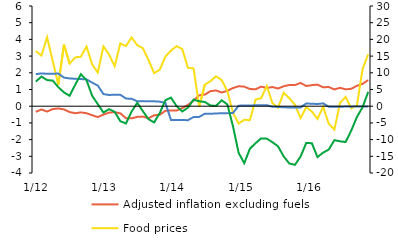
| Category | Adjusted inflation excluding fuels | Food prices |
|---|---|---|
|  1/12 | -0.338 | 3.311 |
| 2 | -0.197 | 3.036 |
| 3 | -0.32 | 4.13 |
| 4 | -0.171 | 2.702 |
| 5 | -0.134 | 1.287 |
| 6 | -0.193 | 3.686 |
| 7 | -0.351 | 2.554 |
| 8 | -0.421 | 2.92 |
| 9 | -0.37 | 2.967 |
| 10 | -0.42 | 3.572 |
| 11 | -0.54 | 2.506 |
| 12 | -0.652 | 2.015 |
|  1/13 | -0.505 | 3.583 |
| 2 | -0.381 | 3.091 |
| 3 | -0.36 | 2.394 |
| 4 | -0.424 | 3.758 |
| 5 | -0.72 | 3.601 |
| 6 | -0.727 | 4.119 |
| 7 | -0.64 | 3.656 |
| 8 | -0.622 | 3.475 |
| 9 | -0.724 | 2.771 |
| 10 | -0.545 | 1.976 |
| 11 | -0.511 | 2.189 |
| 12 | -0.275 | 2.971 |
|  1/14 | -0.256 | 3.33 |
| 2 | -0.26 | 3.598 |
| 3 | -0.111 | 3.419 |
| 4 | 0.076 | 2.299 |
| 5 | 0.335 | 2.261 |
| 6 | 0.655 | -0.023 |
| 7 | 0.696 | 1.287 |
| 8 | 0.902 | 1.502 |
| 9 | 0.94 | 1.79 |
| 10 | 0.822 | 1.558 |
| 11 | 0.92 | 0.908 |
| 12 | 1.086 | -0.394 |
|   1/15 | 1.195 | -1.038 |
| 2 | 1.172 | -0.812 |
| 3 | 1.031 | -0.84 |
| 4 | 1.011 | 0.392 |
| 5 | 1.173 | 0.486 |
| 6 | 1.089 | 1.21 |
| 7 | 1.148 | 0.185 |
| 8 | 1.061 | -0.093 |
| 9 | 1.196 | 0.807 |
| 10 | 1.271 | 0.479 |
| 11 | 1.265 | 0.088 |
| 12 | 1.393 | -0.713 |
|   1/16 | 1.209 | -0.062 |
| 2 | 1.262 | -0.32 |
| 3 | 1.295 | -0.762 |
| 4 | 1.129 | -0.032 |
| 5 | 1.149 | -1.052 |
| 6 | 1.003 | -1.398 |
| 7 | 1.101 | 0.197 |
| 8 | 1.01 | 0.556 |
| 9 | 1.042 | -0.132 |
| 10 | 1.223 | 0.038 |
| 11 | 1.337 | 2.22 |
| 12 | 1.563 | 3.112 |